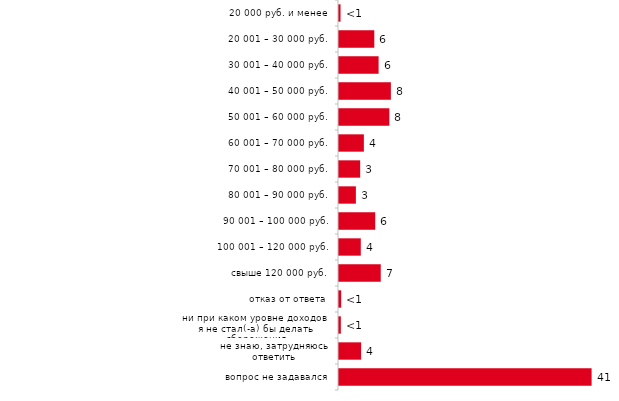
| Category | Series 0 |
|---|---|
| 20 000 руб. и менее | 0.248 |
| 20 001 – 30 000 руб. | 5.693 |
| 30 001 – 40 000 руб. | 6.386 |
| 40 001 – 50 000 руб. | 8.366 |
| 50 001 – 60 000 руб. | 8.119 |
| 60 001 – 70 000 руб. | 4.01 |
| 70 001 – 80 000 руб. | 3.416 |
| 80 001 – 90 000 руб. | 2.723 |
| 90 001 – 100 000 руб. | 5.842 |
| 100 001 – 120 000 руб. | 3.515 |
| свыше 120 000 руб. | 6.733 |
| отказ от ответа | 0.347 |
| ни при каком уровне доходов я не стал(-а) бы делать сбережения | 0.297 |
| не знаю, затрудняюсь ответить | 3.564 |
| вопрос не задавался | 40.743 |